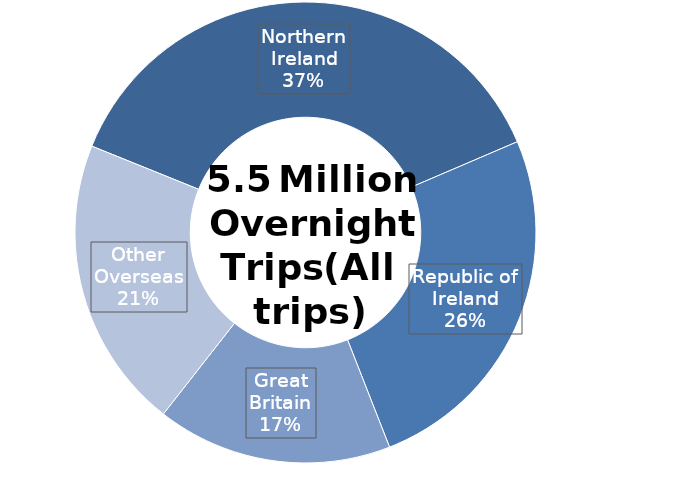
| Category | Series 0 |
|---|---|
| Northern Ireland | 2072200 |
| Republic of Ireland | 1411353 |
| Great Britain | 913954 |
| Other Overseas | 1136480 |